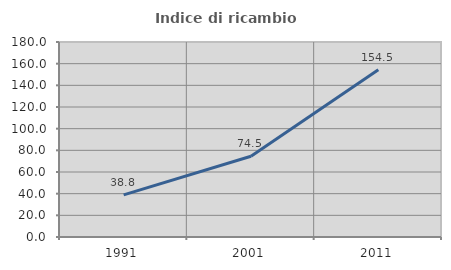
| Category | Indice di ricambio occupazionale  |
|---|---|
| 1991.0 | 38.839 |
| 2001.0 | 74.483 |
| 2011.0 | 154.489 |